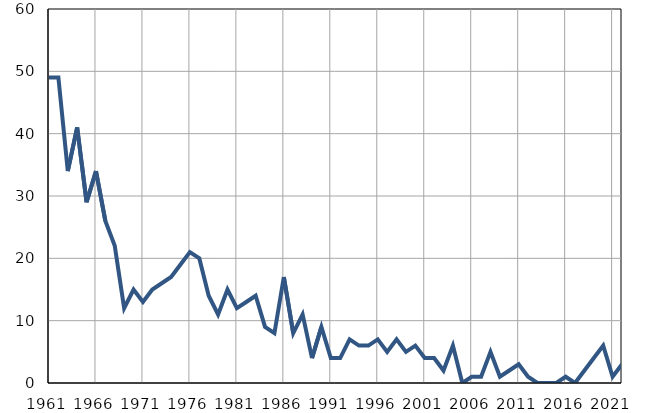
| Category | Умрла 
одојчад |
|---|---|
| 1961.0 | 49 |
| 1962.0 | 49 |
| 1963.0 | 34 |
| 1964.0 | 41 |
| 1965.0 | 29 |
| 1966.0 | 34 |
| 1967.0 | 26 |
| 1968.0 | 22 |
| 1969.0 | 12 |
| 1970.0 | 15 |
| 1971.0 | 13 |
| 1972.0 | 15 |
| 1973.0 | 16 |
| 1974.0 | 17 |
| 1975.0 | 19 |
| 1976.0 | 21 |
| 1977.0 | 20 |
| 1978.0 | 14 |
| 1979.0 | 11 |
| 1980.0 | 15 |
| 1981.0 | 12 |
| 1982.0 | 13 |
| 1983.0 | 14 |
| 1984.0 | 9 |
| 1985.0 | 8 |
| 1986.0 | 17 |
| 1987.0 | 8 |
| 1988.0 | 11 |
| 1989.0 | 4 |
| 1990.0 | 9 |
| 1991.0 | 4 |
| 1992.0 | 4 |
| 1993.0 | 7 |
| 1994.0 | 6 |
| 1995.0 | 6 |
| 1996.0 | 7 |
| 1997.0 | 5 |
| 1998.0 | 7 |
| 1999.0 | 5 |
| 2000.0 | 6 |
| 2001.0 | 4 |
| 2002.0 | 4 |
| 2003.0 | 2 |
| 2004.0 | 6 |
| 2005.0 | 0 |
| 2006.0 | 1 |
| 2007.0 | 1 |
| 2008.0 | 5 |
| 2009.0 | 1 |
| 2010.0 | 2 |
| 2011.0 | 3 |
| 2012.0 | 1 |
| 2013.0 | 0 |
| 2014.0 | 0 |
| 2015.0 | 0 |
| 2016.0 | 1 |
| 2017.0 | 0 |
| 2018.0 | 2 |
| 2019.0 | 4 |
| 2020.0 | 6 |
| 2021.0 | 1 |
| 2022.0 | 3 |